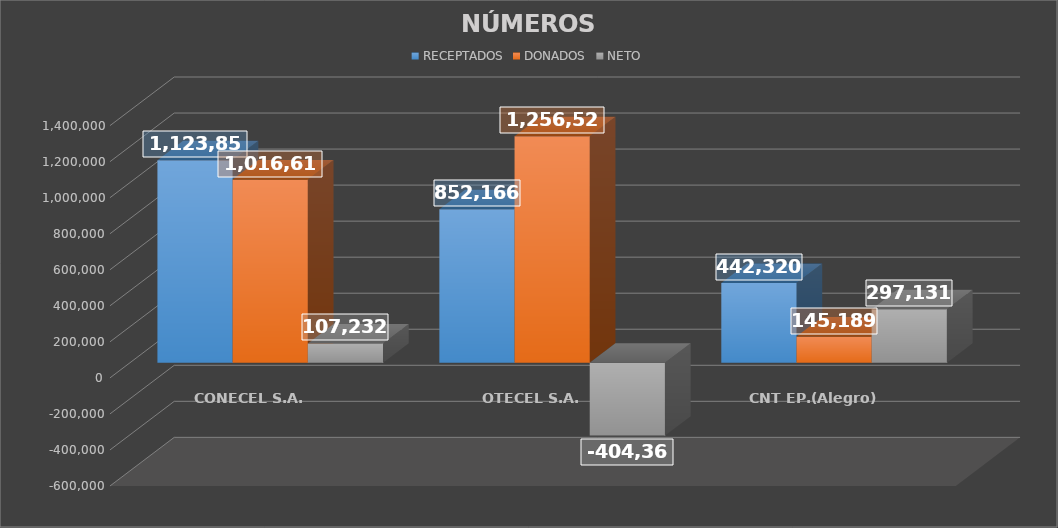
| Category | RECEPTADOS | DONADOS | NETO |
|---|---|---|---|
| CONECEL S.A. | 1123851 | 1016619 | 107232 |
| OTECEL S.A. | 852166 | 1256529 | -404363 |
| CNT EP.(Alegro) | 442320 | 145189 | 297131 |